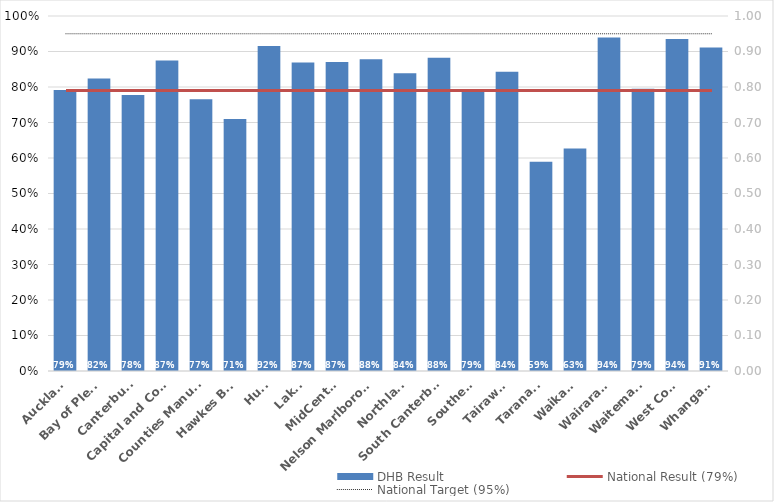
| Category | DHB Result |
|---|---|
| Auckland | 0.791 |
| Bay of Plenty | 0.824 |
| Canterbury | 0.778 |
| Capital and Coast | 0.874 |
| Counties Manukau | 0.765 |
| Hawkes Bay | 0.71 |
| Hutt | 0.915 |
| Lakes | 0.869 |
| MidCentral | 0.87 |
| Nelson Marlborough | 0.878 |
| Northland | 0.839 |
| South Canterbury | 0.883 |
| Southern | 0.787 |
| Tairawhiti | 0.843 |
| Taranaki | 0.589 |
| Waikato | 0.627 |
| Wairarapa | 0.94 |
| Waitemata | 0.795 |
| West Coast | 0.935 |
| Whanganui | 0.911 |